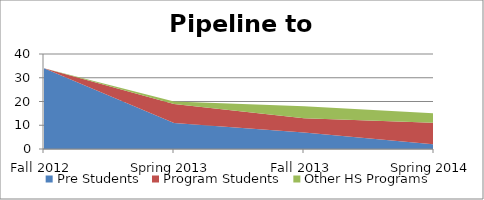
| Category | Pre Students | Program Students | Other HS Programs |
|---|---|---|---|
| Fall 2012 | 34 | 0 | 0 |
| Spring 2013 | 11 | 8 | 1 |
| Fall 2013 | 7 | 6 | 5 |
| Spring 2014 | 2 | 9 | 4 |